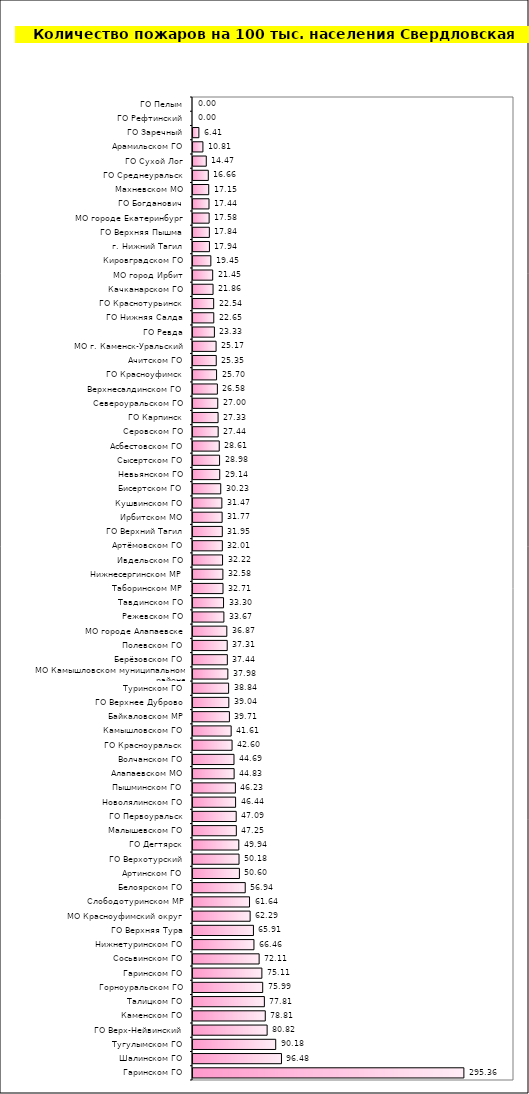
| Category | Series 0 |
|---|---|
| Гаринском ГО | 295.359 |
| Шалинском ГО | 96.476 |
| Тугулымском ГО | 90.176 |
| ГО Верх-Нейвинский | 80.824 |
| Каменском ГО | 78.805 |
| Талицком ГО | 77.807 |
| Горноуральском ГО | 75.995 |
| Гаринском ГО | 75.113 |
| Сосьвинском ГО | 72.114 |
| Нижнетуринском ГО | 66.456 |
| ГО Верхняя Тура | 65.912 |
| МО Красноуфимский округ | 62.288 |
| Слободотуринском МР | 61.638 |
| Белоярском ГО | 56.941 |
| Артинском ГО | 50.602 |
| ГО Верхотурский | 50.176 |
| ГО Дегтярск | 49.944 |
| Малышевском ГО | 47.255 |
| ГО Первоуральск | 47.091 |
| Новолялинском ГО | 46.438 |
| Пышминском ГО | 46.234 |
| Алапаевском МО | 44.83 |
| Волчанском ГО | 44.693 |
| ГО Красноуральск | 42.599 |
| Камышловском ГО | 41.613 |
| Байкаловском МР | 39.709 |
| ГО Верхнее Дуброво | 39.04 |
| Туринском ГО | 38.842 |
| МО Камышловском муниципальном районе | 37.981 |
| Берёзовском ГО | 37.441 |
| Полевском ГО | 37.306 |
| МО городе Алапаевске | 36.869 |
| Режевском ГО | 33.675 |
| Тавдинском ГО | 33.304 |
| Таборинском МР | 32.712 |
| Нижнесергинском МР | 32.577 |
| Ивдельском ГО | 32.216 |
| Артёмовском ГО | 32.011 |
| ГО Верхний Тагил | 31.954 |
| Ирбитском МО | 31.765 |
| Кушвинском ГО | 31.47 |
| Бисертском ГО | 30.233 |
| Невьянском ГО | 29.142 |
| Сысертском ГО | 28.977 |
| Асбестовском ГО | 28.614 |
| Серовском ГО | 27.441 |
| ГО Карпинск | 27.33 |
| Североуральском ГО | 27 |
| Верхнесалдинском ГО | 26.584 |
| ГО Красноуфимск | 25.697 |
| Ачитском ГО | 25.349 |
| МО г. Каменск-Уральский | 25.171 |
| ГО Ревда | 23.326 |
| ГО Нижняя Салда | 22.65 |
| ГО Краснотурьинск | 22.538 |
| Качканарском ГО | 21.865 |
| МО город Ирбит | 21.45 |
| Кировградском ГО | 19.45 |
| г. Нижний Тагил | 17.937 |
| ГО Верхняя Пышма | 17.835 |
| МО городе Екатеринбург | 17.582 |
| ГО Богданович | 17.439 |
| Махневском МО | 17.153 |
| ГО Среднеуральск | 16.663 |
| ГО Сухой Лог | 14.474 |
| Арамильском ГО | 10.807 |
| ГО Заречный | 6.413 |
| ГО Рефтинский | 0 |
| ГО Пелым | 0 |